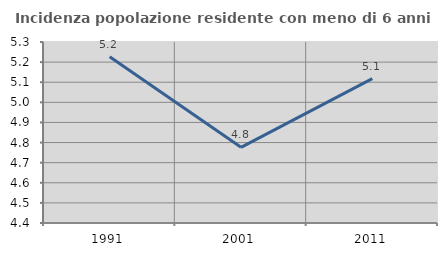
| Category | Incidenza popolazione residente con meno di 6 anni |
|---|---|
| 1991.0 | 5.227 |
| 2001.0 | 4.776 |
| 2011.0 | 5.118 |